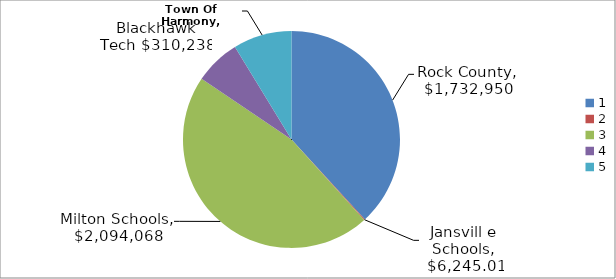
| Category | Series 0 |
|---|---|
| 0 | 1732950 |
| 1 | 6245.01 |
| 2 | 2094068 |
| 3 | 310238 |
| 4 | 395873 |